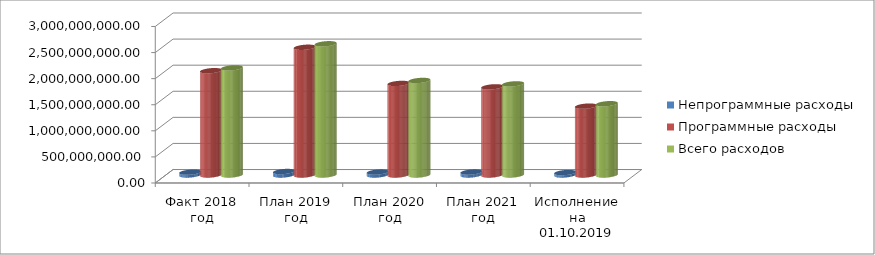
| Category | Непрограммные расходы | Программные расходы | Всего расходов |
|---|---|---|---|
| Факт 2018 год | 54110787.01 | 1999126115.26 | 2053236902.27 |
| План 2019 год | 66998923.62 | 2448342941.59 | 2515341865.21 |
| План 2020 год | 56853820 | 1755264540 | 1812118360 |
| План 2021 год | 56988106 | 1689644047 | 1746632153 |
| Исполнение на 01.10.2019 года | 46348537.25 | 1320118537.13 | 1366467074.38 |